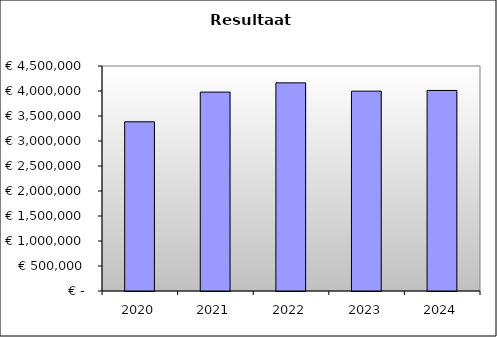
| Category | Series 0 |
|---|---|
| 2020.0 | 3383945.227 |
| 2021.0 | 3977821.674 |
| 2022.0 | 4162797.899 |
| 2023.0 | 3996850.284 |
| 2024.0 | 4010912.334 |